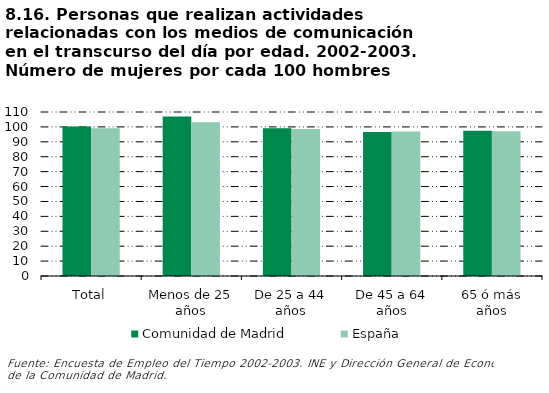
| Category | Comunidad de Madrid | España |
|---|---|---|
| Total | 100.344 | 99.078 |
| Menos de 25 años | 106.98 | 103.092 |
| De 25 a 44 años | 99.167 | 98.566 |
| De 45 a 64 años | 96.571 | 96.857 |
| 65 ó más años | 97.449 | 97.122 |